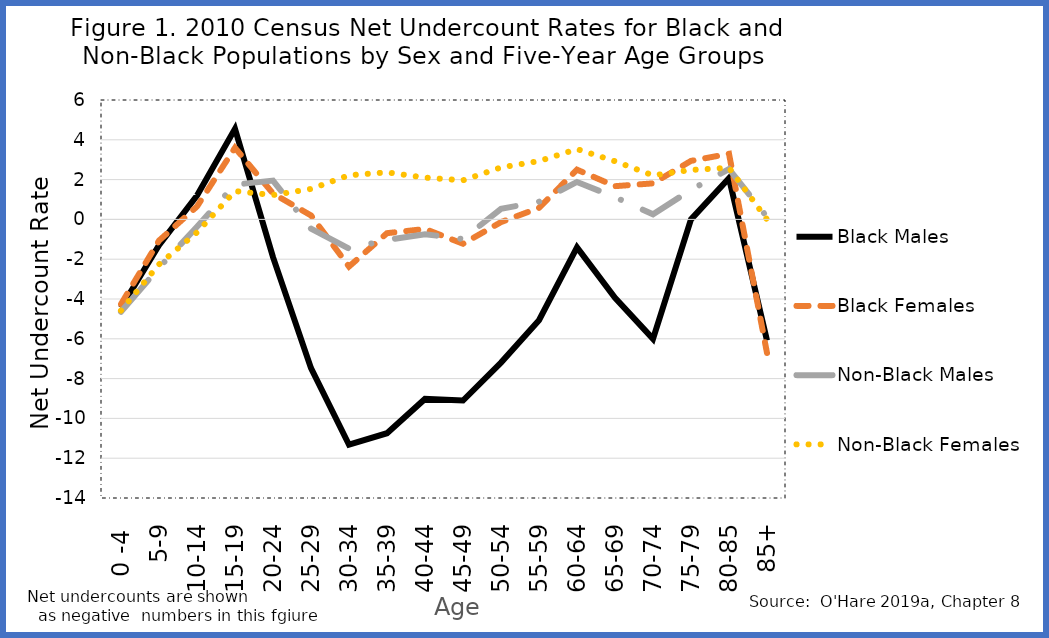
| Category | Black Males | Black Females | Non-Black Males | Non-Black Females |
|---|---|---|---|---|
| 0 -4  | -4.442 | -4.257 | -4.642 | -4.58 |
| 5-9 | -1.292 | -1.067 | -2.433 | -2.26 |
| 10-14 | 1.199 | 0.649 | -0.366 | -0.651 |
| 15-19 | 4.551 | 3.599 | 1.748 | 1.423 |
| 20-24 | -1.897 | 1.3 | 1.95 | 1.223 |
| 25-29 | -7.474 | 0.199 | -0.463 | 1.531 |
| 30-34 | -11.323 | -2.37 | -1.473 | 2.219 |
| 35-39 | -10.744 | -0.692 | -1.027 | 2.364 |
| 40-44 | -9.021 | -0.48 | -0.742 | 2.099 |
| 45-49 | -9.103 | -1.223 | -0.986 | 1.964 |
| 50-54 | -7.194 | -0.137 | 0.532 | 2.611 |
| 55-59 | -5.064 | 0.579 | 0.891 | 2.929 |
| 60-64 | -1.405 | 2.5 | 1.883 | 3.533 |
| 65-69 | -3.94 | 1.669 | 1.117 | 2.923 |
| 70-74 | -6.005 | 1.811 | 0.258 | 2.212 |
| 75-79 | 0 | 2.941 | 1.483 | 2.486 |
| 80-85 | 2.069 | 3.297 | 2.532 | 2.592 |
| 85+ | -6.087 | -6.711 | 0.119 | 0 |